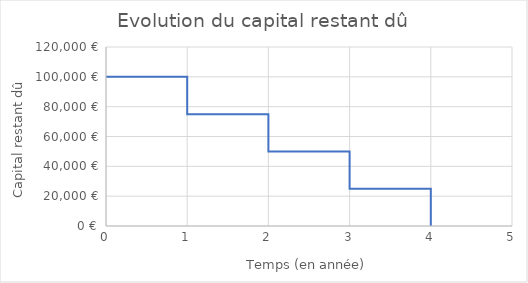
| Category | Series 0 |
|---|---|
| 0.0 | 100000 |
| 1.0 | 100000 |
| 1.0 | 75000 |
| 2.0 | 75000 |
| 2.0 | 50000 |
| 3.0 | 50000 |
| 3.0 | 25000 |
| 4.0 | 25000 |
| 4.0 | 0 |